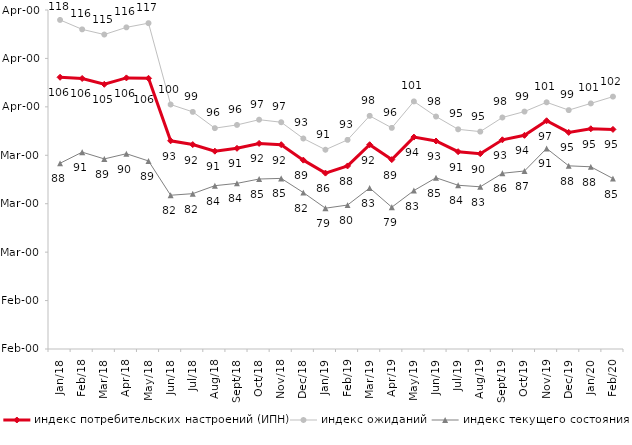
| Category | индекс потребительских настроений (ИПН) | Series 0 | индекс ожиданий | Series 3 | индекс текущего состояния |
|---|---|---|---|---|---|
| 2018-01-01 | 106.11 | 2018-01-01 | 117.95 | 2018-01-01 | 88.35 |
| 2018-02-01 | 105.86 | 2018-02-01 | 116 | 2018-02-01 | 90.65 |
| 2018-03-01 | 104.66 | 2018-03-01 | 114.933 | 2018-03-01 | 89.25 |
| 2018-04-01 | 105.98 | 2018-04-01 | 116.417 | 2018-04-01 | 90.325 |
| 2018-05-01 | 105.9 | 2018-05-01 | 117.283 | 2018-05-01 | 88.825 |
| 2018-06-01 | 92.99 | 2018-06-01 | 100.483 | 2018-06-01 | 81.75 |
| 2018-07-01 | 92.21 | 2018-07-01 | 98.967 | 2018-07-01 | 82.075 |
| 2018-08-01 | 90.85 | 2018-08-01 | 95.6 | 2018-08-01 | 83.725 |
| 2018-09-01 | 91.44 | 2018-09-01 | 96.267 | 2018-09-01 | 84.2 |
| 2018-10-01 | 92.45 | 2018-10-01 | 97.35 | 2018-10-01 | 85.1 |
| 2018-11-01 | 92.186 | 2018-11-01 | 96.823 | 2018-11-01 | 85.23 |
| 2018-12-01 | 89 | 2018-12-01 | 93.467 | 2018-12-01 | 82.3 |
| 2019-01-01 | 86.32 | 2019-01-01 | 91.15 | 2019-01-01 | 79.075 |
| 2019-02-01 | 87.8 | 2019-02-01 | 93.183 | 2019-02-01 | 79.725 |
| 2019-03-01 | 92.183 | 2019-03-01 | 98.144 | 2019-03-01 | 83.242 |
| 2019-04-01 | 89.109 | 2019-04-01 | 95.66 | 2019-04-01 | 79.282 |
| 2019-05-01 | 93.759 | 2019-05-01 | 101.123 | 2019-05-01 | 82.714 |
| 2019-06-01 | 92.948 | 2019-06-01 | 98.005 | 2019-06-01 | 85.362 |
| 2019-07-01 | 90.743 | 2019-07-01 | 95.363 | 2019-07-01 | 83.812 |
| 2019-08-01 | 90.33 | 2019-08-01 | 94.888 | 2019-08-01 | 83.492 |
| 2019-09-01 | 93.198 | 2019-09-01 | 97.805 | 2019-09-01 | 86.287 |
| 2019-10-01 | 94.119 | 2019-10-01 | 99.026 | 2019-10-01 | 86.757 |
| 2019-11-01 | 97.129 | 2019-11-01 | 100.941 | 2019-11-01 | 91.411 |
| 2019-12-01 | 94.723 | 2019-12-01 | 99.323 | 2019-12-01 | 87.822 |
| 2020-01-01 | 95.475 | 2020-01-01 | 100.71 | 2020-01-01 | 87.624 |
| 2020-02-01 | 95.347 | 2020-02-01 | 102.112 | 2020-02-01 | 85.198 |